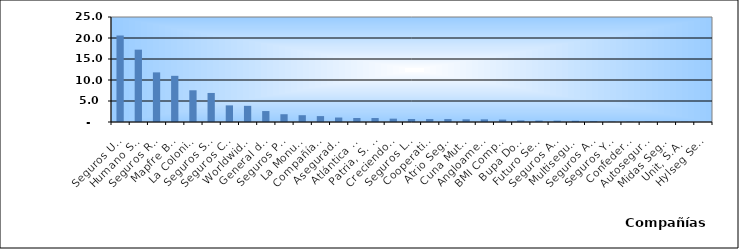
| Category | Series 0 |
|---|---|
| Seguros Universal, S. A. | 20.597 |
| Humano Seguros, S. A. | 17.223 |
| Seguros Reservas, S. A. | 11.816 |
| Mapfre BHD Compañía de Seguros | 10.993 |
| La Colonial, S. A., Compañia De Seguros | 7.553 |
| Seguros Sura, S.A. | 6.915 |
| Seguros Crecer, S. A. | 3.957 |
| Worldwide Seguros, S. A. | 3.849 |
| General de Seguros, S. A. | 2.604 |
| Seguros Pepín, S. A. | 1.851 |
| La Monumental de Seguros, S. A. | 1.618 |
| Compañía Dominicana de Seguros, C. por A. | 1.404 |
| Aseguradora Agropecuaria Dominicana, S. A. | 1.063 |
| Atlántica Seguros, S. A. | 0.947 |
| Patria, S. A., Compañía de Seguros | 0.945 |
| Creciendo Seguros | 0.797 |
| Seguros La Internacional, S. A. | 0.709 |
| Cooperativa Nacional De Seguros, Inc  | 0.702 |
| Atrio Seguros S. A. | 0.7 |
| Cuna Mutual Insurance Society Dominicana | 0.642 |
| Angloamericana de Seguros, S. A. | 0.633 |
| BMI Compañía de Seguros, S. A. | 0.573 |
| Bupa Dominicana, S. A. | 0.381 |
| Futuro Seguros | 0.339 |
| Seguros Ademi, S.A. | 0.32 |
| Multiseguros Su, S.A. | 0.292 |
| Seguros APS, S.R.L. | 0.196 |
| Seguros Yunen, S.A. | 0.094 |
| Confederación del Canadá Dominicana, S. A. | 0.089 |
| Autoseguro, S. A. | 0.074 |
| Midas Seguros, S.A. | 0.061 |
| Unit, S.A. | 0.05 |
| Hylseg Seguros S.A | 0.015 |